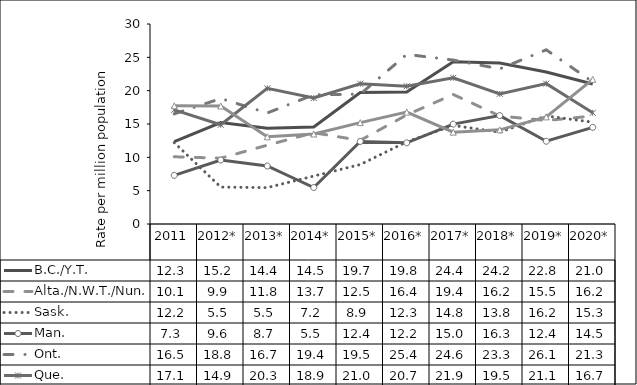
| Category | B.C./Y.T. | Alta./N.W.T./Nun. | Sask. | Man. | Ont. | Que. | Atlantic |
|---|---|---|---|---|---|---|---|
| 2011 | 12.342 | 10.086 | 12.195 | 7.295 | 16.514 | 17.114 | 17.729 |
| 2012* | 15.207 | 9.866 | 5.536 | 9.6 | 18.819 | 14.886 | 17.7 |
| 2013* | 14.357 | 11.822 | 5.456 | 8.698 | 16.653 | 20.343 | 13.079 |
| 2014* | 14.544 | 13.69 | 7.188 | 5.473 | 19.387 | 18.895 | 13.502 |
| 2015* | 19.734 | 12.544 | 8.921 | 12.382 | 19.479 | 21.039 | 15.203 |
| 2016* | 19.805 | 16.364 | 12.324 | 12.175 | 25.441 | 20.666 | 16.789 |
| 2017* | 24.351 | 19.429 | 14.778 | 14.984 | 24.591 | 21.922 | 13.777 |
| 2018* | 24.153 | 16.205 | 13.772 | 16.262 | 23.273 | 19.52 | 14.122 |
| 2019* | 22.796 | 15.522 | 16.207 | 12.413 | 26.126 | 21.055 | 16.067 |
| 2020* | 21.003 | 16.199 | 15.271 | 14.5 | 21.311 | 16.677 | 21.699 |